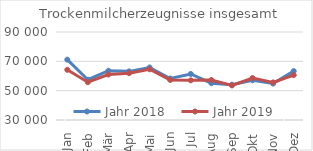
| Category | Jahr 2018 | Jahr 2019 |
|---|---|---|
| Jan | 71143.712 | 64232.927 |
| Feb | 57472.675 | 55770.16 |
| Mär | 63603.013 | 61020.036 |
| Apr | 63169.899 | 61941.111 |
| Mai | 65826.158 | 64590.355 |
| Jun | 58271.304 | 57305.322 |
| Jul | 61397.834 | 57034.588 |
| Aug | 55073.369 | 57256.64 |
| Sep | 54045.714 | 53604.034 |
| Okt | 57096.631 | 58608.365 |
| Nov | 54847.898 | 55642.38 |
| Dez | 63344.974 | 60606.448 |